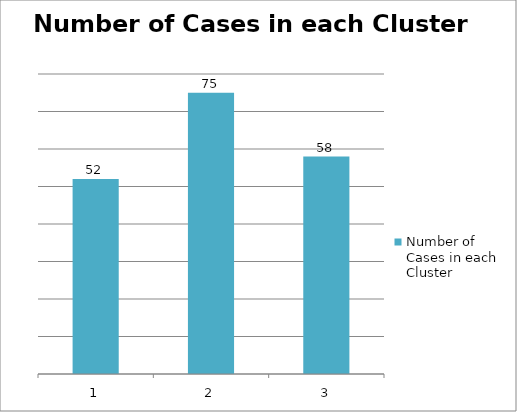
| Category | Number of Cases in each Cluster |
|---|---|
| 1 | 52 |
| 2 | 75 |
| 3 | 58 |